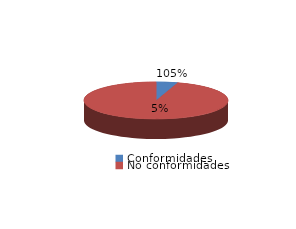
| Category | Series 0 |
|---|---|
| Conformidades | 4848 |
| No conformidades | -223 |